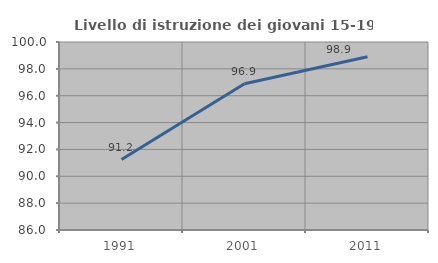
| Category | Livello di istruzione dei giovani 15-19 anni |
|---|---|
| 1991.0 | 91.249 |
| 2001.0 | 96.885 |
| 2011.0 | 98.903 |